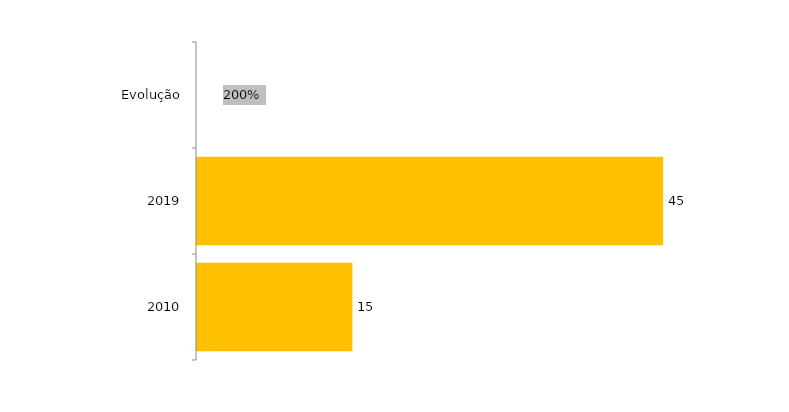
| Category | Evolução Ingressantes |
|---|---|
| 2010 | 15 |
| 2019 | 45 |
| Evolução | 2 |